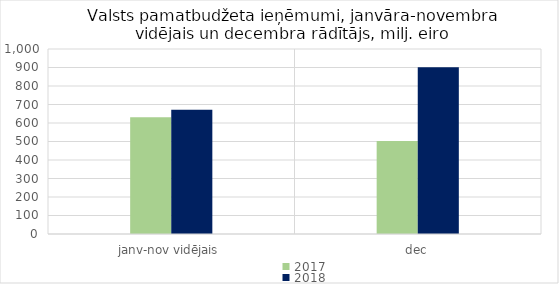
| Category | 2017 | 2018 |
|---|---|---|
| janv-nov vidējais | 631546.156 | 671905.081 |
| dec | 502474.488 | 900960.999 |